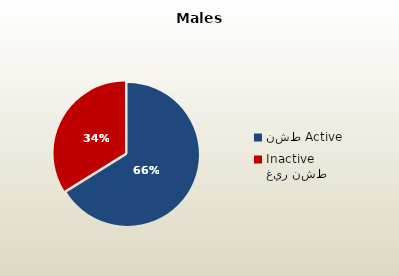
| Category | الذكور القطريين  Qatari Males |
|---|---|
| نشط Active | 70963 |
| غير نشط Inactive | 36308 |